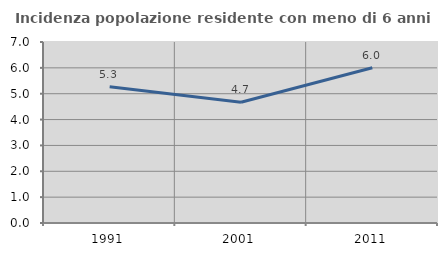
| Category | Incidenza popolazione residente con meno di 6 anni |
|---|---|
| 1991.0 | 5.272 |
| 2001.0 | 4.673 |
| 2011.0 | 6.003 |